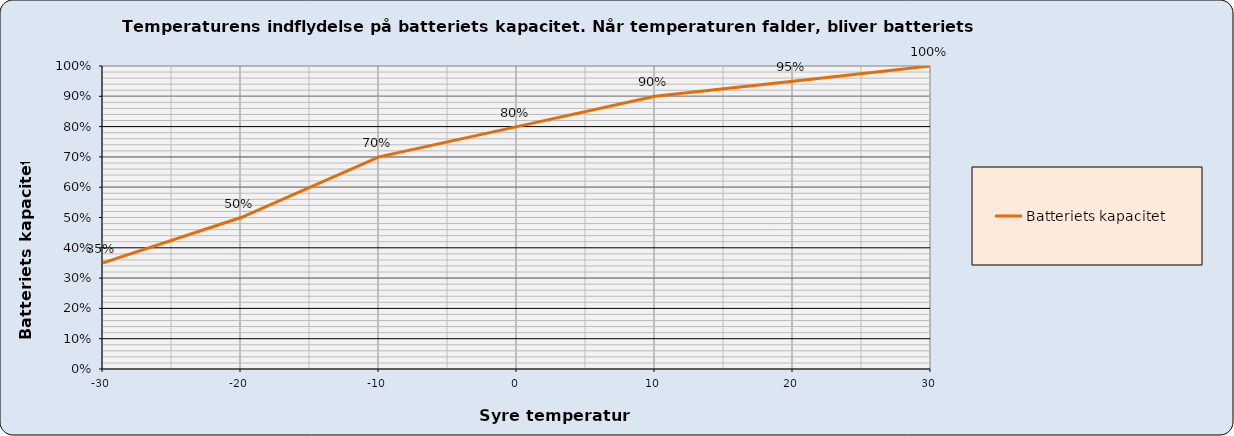
| Category | Batteriets kapacitet  |
|---|---|
| -30.0 | 0.35 |
| -20.0 | 0.5 |
| -10.0 | 0.7 |
| 0.0 | 0.8 |
| 10.0 | 0.9 |
| 20.0 | 0.95 |
| 30.0 | 1 |